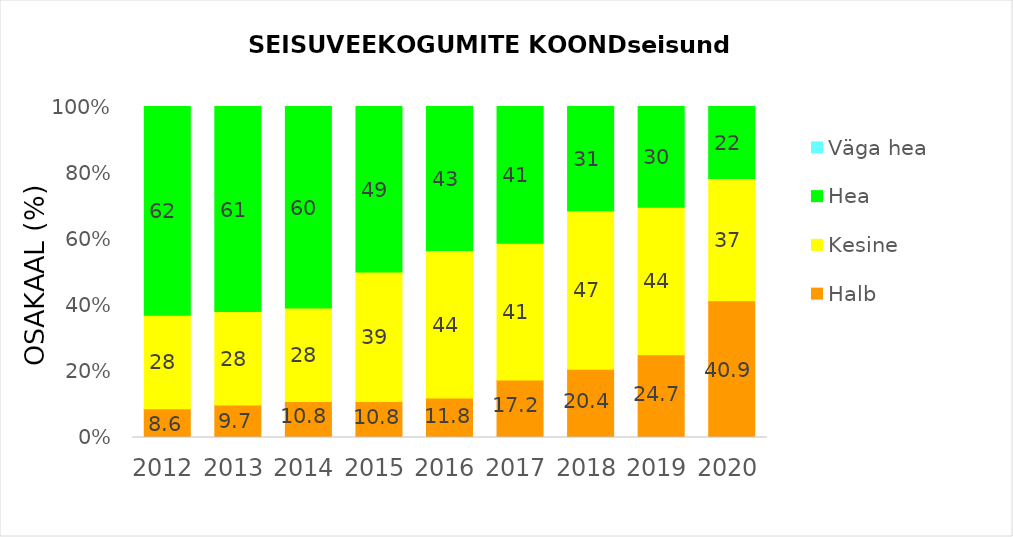
| Category | Halb | Kesine | Hea | Väga hea |
|---|---|---|---|---|
| 2012.0 | 8.602 | 27.957 | 62.366 | 0 |
| 2013.0 | 9.677 | 27.957 | 61.29 | 0 |
| 2014.0 | 10.753 | 27.957 | 60.215 | 0 |
| 2015.0 | 10.753 | 38.71 | 49.462 | 0 |
| 2016.0 | 11.828 | 44.086 | 43.011 | 0 |
| 2017.0 | 17.204 | 40.86 | 40.86 | 0 |
| 2018.0 | 20.43 | 47.312 | 31.183 | 0 |
| 2019.0 | 24.731 | 44.086 | 30.108 | 0 |
| 2020.0 | 40.86 | 36.559 | 21.505 | 0 |